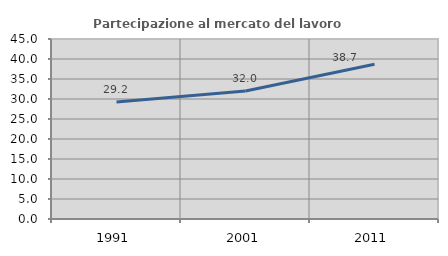
| Category | Partecipazione al mercato del lavoro  femminile |
|---|---|
| 1991.0 | 29.241 |
| 2001.0 | 31.993 |
| 2011.0 | 38.665 |